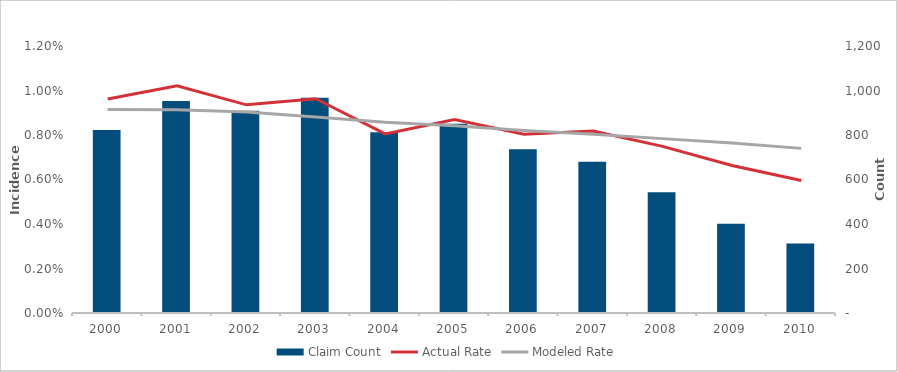
| Category | Claim Count |
|---|---|
| 2000.0 | 822 |
| 2001.0 | 953 |
| 2002.0 | 909 |
| 2003.0 | 967 |
| 2004.0 | 812 |
| 2005.0 | 851 |
| 2006.0 | 736 |
| 2007.0 | 680 |
| 2008.0 | 543 |
| 2009.0 | 401 |
| 2010.0 | 312 |